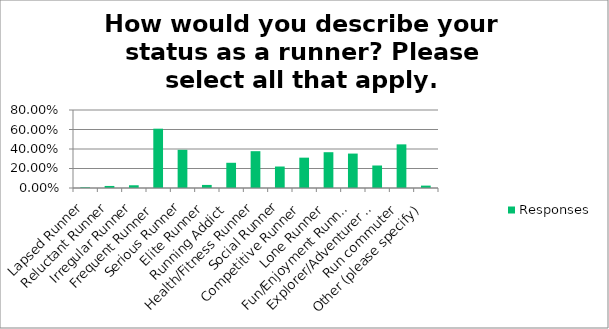
| Category | Responses |
|---|---|
| Lapsed Runner | 0.007 |
| Reluctant Runner | 0.021 |
| Irregular Runner | 0.028 |
| Frequent Runner | 0.608 |
| Serious Runner | 0.392 |
| Elite Runner | 0.032 |
| Running Addict | 0.259 |
| Health/Fitness Runner | 0.378 |
| Social Runner | 0.22 |
| Competitive Runner | 0.311 |
| Lone Runner | 0.367 |
| Fun/Enjoyment Runner | 0.353 |
| Explorer/Adventurer Runner | 0.231 |
| Run commuter | 0.448 |
| Other (please specify) | 0.024 |